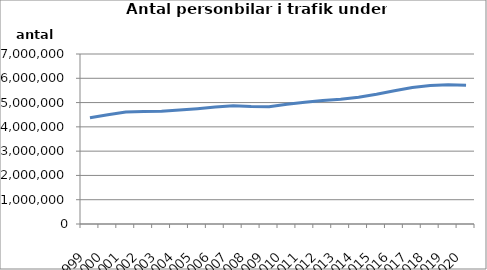
| Category | Series 0 |
|---|---|
| 1999.0 | 4370924 |
| 2000.0 | 4496868 |
| 2001.0 | 4616118 |
| 2002.0 | 4628334 |
| 2003.0 | 4643535 |
| 2004.0 | 4689599 |
| 2005.0 | 4744718 |
| 2006.0 | 4813525 |
| 2007.0 | 4867107 |
| 2008.0 | 4833533 |
| 2009.0 | 4827462 |
| 2010.0 | 4934447 |
| 2011.0 | 5017674 |
| 2012.0 | 5084351 |
| 2013.0 | 5133323 |
| 2014.0 | 5222751 |
| 2015.0 | 5346543 |
| 2016.0 | 5488070 |
| 2017.0 | 5619968 |
| 2018.0 | 5701798 |
| 2019.0 | 5733321 |
| 2020.0 | 5711535 |